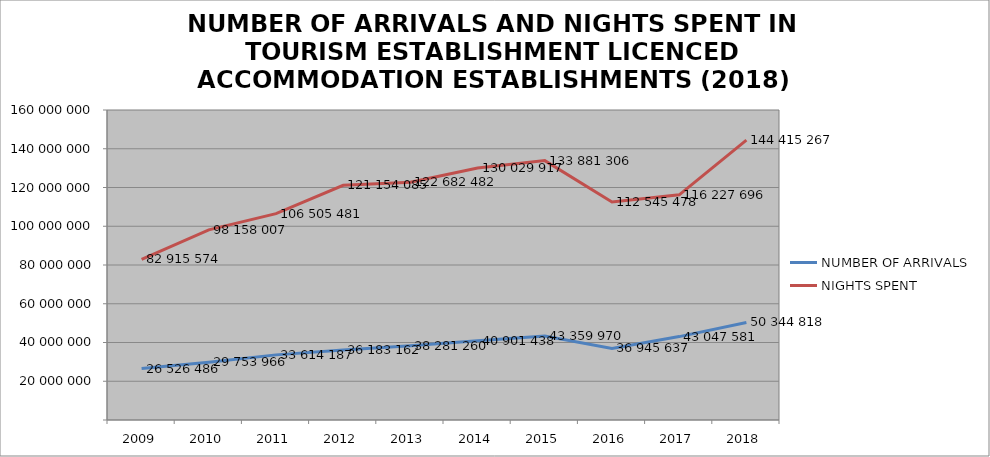
| Category | NUMBER OF ARRIVALS | NIGHTS SPENT |
|---|---|---|
| 2009 | 26526486 | 82915574 |
| 2010 | 29753966 | 98158007 |
| 2011 | 33614187 | 106505481 |
| 2012 | 36183162 | 121154085 |
| 2013 | 38281260 | 122682482 |
| 2014 | 40901438 | 130029917 |
| 2015 | 43359970 | 133881306 |
| 2016 | 36945637 | 112545478 |
| 2017 | 43047581 | 116227696 |
| 2018 | 50344818 | 144415267 |